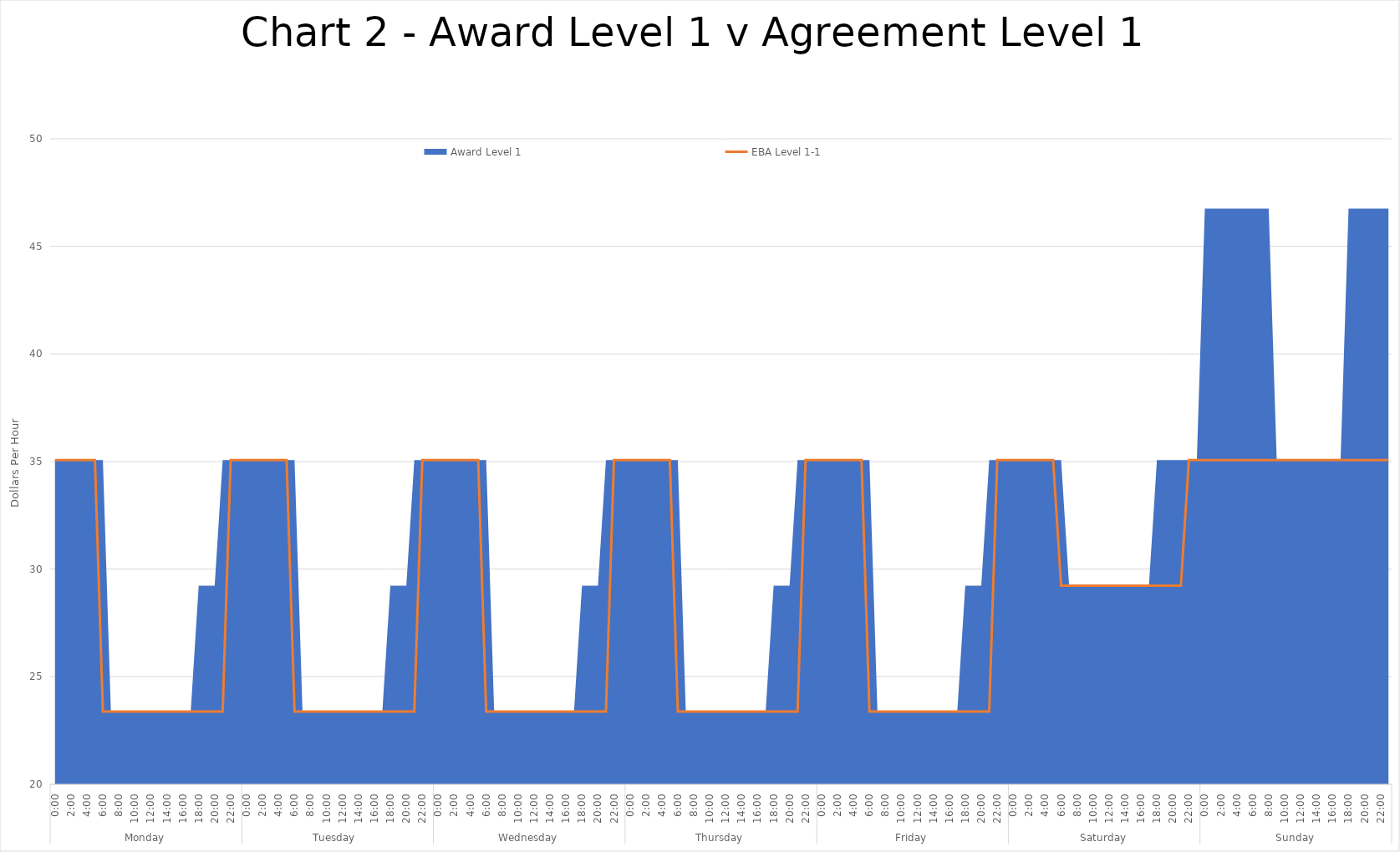
| Category | EBA Level 1-1 |
|---|---|
| 0 | 35.07 |
| 1 | 35.07 |
| 2 | 35.07 |
| 3 | 35.07 |
| 4 | 35.07 |
| 5 | 35.07 |
| 6 | 23.38 |
| 7 | 23.38 |
| 8 | 23.38 |
| 9 | 23.38 |
| 10 | 23.38 |
| 11 | 23.38 |
| 12 | 23.38 |
| 13 | 23.38 |
| 14 | 23.38 |
| 15 | 23.38 |
| 16 | 23.38 |
| 17 | 23.38 |
| 18 | 23.38 |
| 19 | 23.38 |
| 20 | 23.38 |
| 21 | 23.38 |
| 22 | 35.07 |
| 23 | 35.07 |
| 24 | 35.07 |
| 25 | 35.07 |
| 26 | 35.07 |
| 27 | 35.07 |
| 28 | 35.07 |
| 29 | 35.07 |
| 30 | 23.38 |
| 31 | 23.38 |
| 32 | 23.38 |
| 33 | 23.38 |
| 34 | 23.38 |
| 35 | 23.38 |
| 36 | 23.38 |
| 37 | 23.38 |
| 38 | 23.38 |
| 39 | 23.38 |
| 40 | 23.38 |
| 41 | 23.38 |
| 42 | 23.38 |
| 43 | 23.38 |
| 44 | 23.38 |
| 45 | 23.38 |
| 46 | 35.07 |
| 47 | 35.07 |
| 48 | 35.07 |
| 49 | 35.07 |
| 50 | 35.07 |
| 51 | 35.07 |
| 52 | 35.07 |
| 53 | 35.07 |
| 54 | 23.38 |
| 55 | 23.38 |
| 56 | 23.38 |
| 57 | 23.38 |
| 58 | 23.38 |
| 59 | 23.38 |
| 60 | 23.38 |
| 61 | 23.38 |
| 62 | 23.38 |
| 63 | 23.38 |
| 64 | 23.38 |
| 65 | 23.38 |
| 66 | 23.38 |
| 67 | 23.38 |
| 68 | 23.38 |
| 69 | 23.38 |
| 70 | 35.07 |
| 71 | 35.07 |
| 72 | 35.07 |
| 73 | 35.07 |
| 74 | 35.07 |
| 75 | 35.07 |
| 76 | 35.07 |
| 77 | 35.07 |
| 78 | 23.38 |
| 79 | 23.38 |
| 80 | 23.38 |
| 81 | 23.38 |
| 82 | 23.38 |
| 83 | 23.38 |
| 84 | 23.38 |
| 85 | 23.38 |
| 86 | 23.38 |
| 87 | 23.38 |
| 88 | 23.38 |
| 89 | 23.38 |
| 90 | 23.38 |
| 91 | 23.38 |
| 92 | 23.38 |
| 93 | 23.38 |
| 94 | 35.07 |
| 95 | 35.07 |
| 96 | 35.07 |
| 97 | 35.07 |
| 98 | 35.07 |
| 99 | 35.07 |
| 100 | 35.07 |
| 101 | 35.07 |
| 102 | 23.38 |
| 103 | 23.38 |
| 104 | 23.38 |
| 105 | 23.38 |
| 106 | 23.38 |
| 107 | 23.38 |
| 108 | 23.38 |
| 109 | 23.38 |
| 110 | 23.38 |
| 111 | 23.38 |
| 112 | 23.38 |
| 113 | 23.38 |
| 114 | 23.38 |
| 115 | 23.38 |
| 116 | 23.38 |
| 117 | 23.38 |
| 118 | 35.07 |
| 119 | 35.07 |
| 120 | 35.07 |
| 121 | 35.07 |
| 122 | 35.07 |
| 123 | 35.07 |
| 124 | 35.07 |
| 125 | 35.07 |
| 126 | 29.225 |
| 127 | 29.225 |
| 128 | 29.225 |
| 129 | 29.225 |
| 130 | 29.225 |
| 131 | 29.225 |
| 132 | 29.225 |
| 133 | 29.225 |
| 134 | 29.225 |
| 135 | 29.225 |
| 136 | 29.225 |
| 137 | 29.225 |
| 138 | 29.225 |
| 139 | 29.225 |
| 140 | 29.225 |
| 141 | 29.225 |
| 142 | 35.07 |
| 143 | 35.07 |
| 144 | 35.07 |
| 145 | 35.07 |
| 146 | 35.07 |
| 147 | 35.07 |
| 148 | 35.07 |
| 149 | 35.07 |
| 150 | 35.07 |
| 151 | 35.07 |
| 152 | 35.07 |
| 153 | 35.07 |
| 154 | 35.07 |
| 155 | 35.07 |
| 156 | 35.07 |
| 157 | 35.07 |
| 158 | 35.07 |
| 159 | 35.07 |
| 160 | 35.07 |
| 161 | 35.07 |
| 162 | 35.07 |
| 163 | 35.07 |
| 164 | 35.07 |
| 165 | 35.07 |
| 166 | 35.07 |
| 167 | 35.07 |